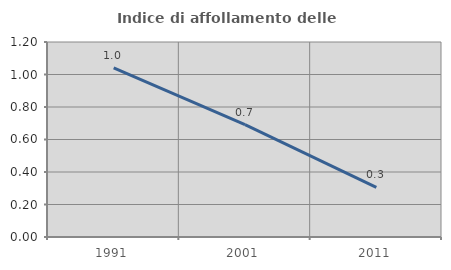
| Category | Indice di affollamento delle abitazioni  |
|---|---|
| 1991.0 | 1.04 |
| 2001.0 | 0.691 |
| 2011.0 | 0.306 |